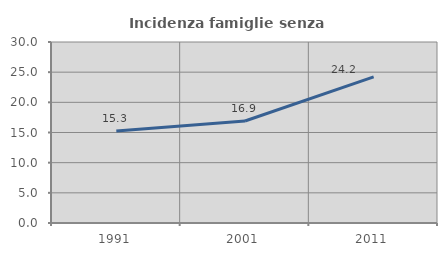
| Category | Incidenza famiglie senza nuclei |
|---|---|
| 1991.0 | 15.263 |
| 2001.0 | 16.91 |
| 2011.0 | 24.208 |